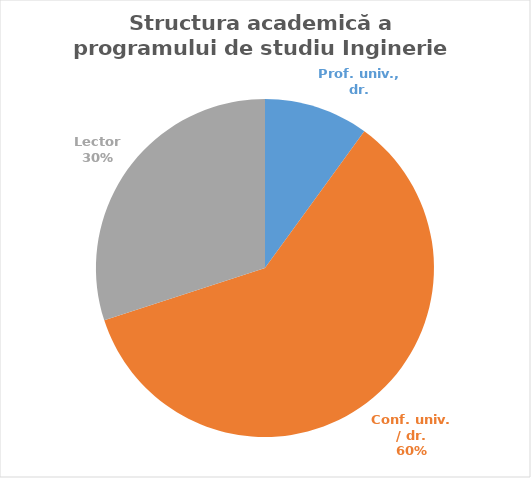
| Category | Series 0 |
|---|---|
| Prof. univ., dr. | 2 |
| Conf. univ. / dr. | 12 |
| Lector | 6 |